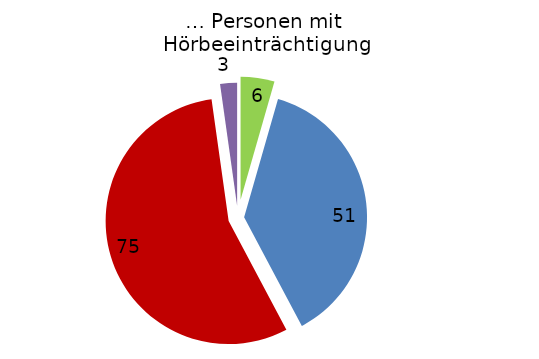
| Category | … Personen mit Hörbeeinträchtigung |
|---|---|
| Auf dem ganzen Campus | 6 |
| Auf Teilen des Campus | 51 |
| Nicht barrierefrei | 75 |
| Keine Angabe | 3 |